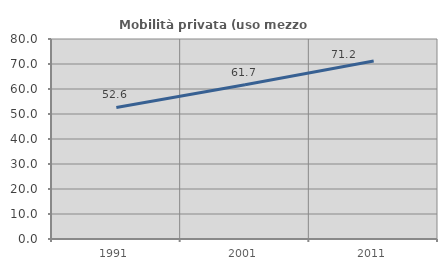
| Category | Mobilità privata (uso mezzo privato) |
|---|---|
| 1991.0 | 52.61 |
| 2001.0 | 61.676 |
| 2011.0 | 71.199 |